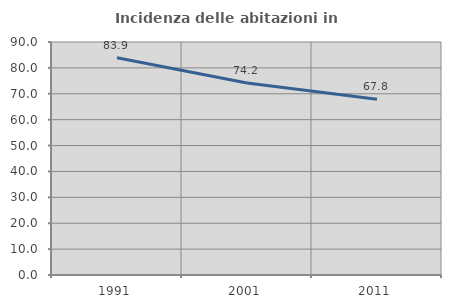
| Category | Incidenza delle abitazioni in proprietà  |
|---|---|
| 1991.0 | 83.906 |
| 2001.0 | 74.155 |
| 2011.0 | 67.844 |